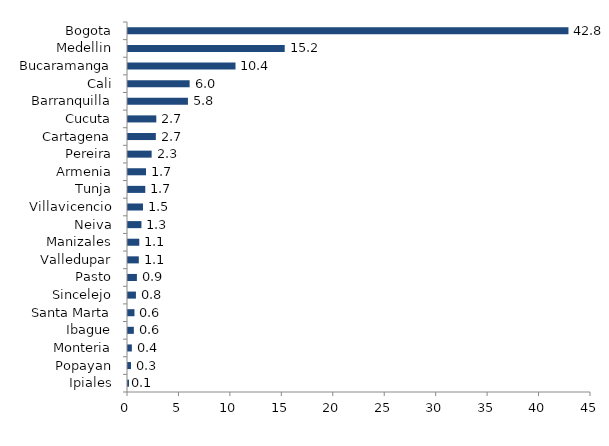
| Category | Series 0 |
|---|---|
| Ipiales | 0.098 |
| Popayan | 0.292 |
| Monteria | 0.376 |
| Ibague | 0.569 |
| Santa Marta | 0.629 |
| Sincelejo | 0.771 |
| Pasto | 0.865 |
| Valledupar | 1.051 |
| Manizales | 1.096 |
| Neiva | 1.309 |
| Villavicencio | 1.456 |
| Tunja | 1.68 |
| Armenia | 1.748 |
| Pereira | 2.298 |
| Cartagena | 2.706 |
| Cucuta | 2.75 |
| Barranquilla | 5.825 |
| Cali | 5.991 |
| Bucaramanga | 10.448 |
| Medellin | 15.231 |
| Bogota | 42.81 |